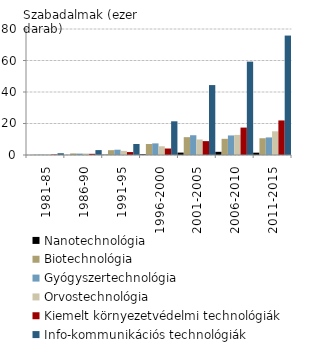
| Category | Nanotechnológia | Biotechnológia | Gyógyszertechnológia | Orvostechnológia | Kiemelt környezetvédelmi technológiák | Info-kommunikációs technológiák |
|---|---|---|---|---|---|---|
| 1981-85 | 8 | 189.2 | 191.6 | 314.4 | 312.8 | 1115.2 |
| 1986-90 | 39.4 | 990.6 | 895.8 | 929.4 | 747.6 | 3116.8 |
| 1991-95 | 149.6 | 3064.6 | 3359.4 | 2633.4 | 1859.4 | 6984.2 |
| 1996-2000 | 457.8 | 6997.6 | 7377.2 | 5544.2 | 4114 | 21398 |
| 2001-2005 | 1533 | 11321.8 | 12544.2 | 9850.6 | 8810.6 | 44399.8 |
| 2006-2010 | 2023.4 | 10273.2 | 12421.4 | 12765.4 | 17404.4 | 59282 |
| 2011-2015 | 1484.2 | 10640 | 11153.8 | 15051.2 | 21945 | 75833.6 |